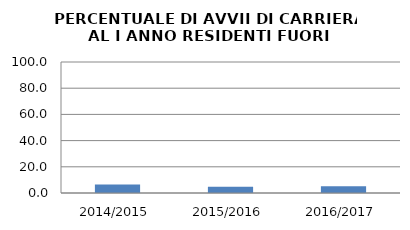
| Category | 2014/2015 2015/2016 2016/2017 |
|---|---|
| 2014/2015 | 6.573 |
| 2015/2016 | 4.683 |
| 2016/2017 | 5.085 |